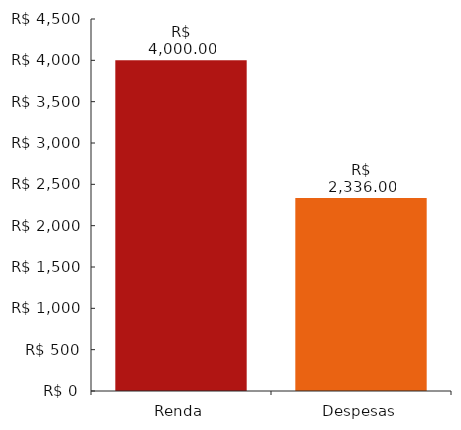
| Category | DadosDoGráfico |
|---|---|
| 0 | 4000 |
| 1 | 2336 |